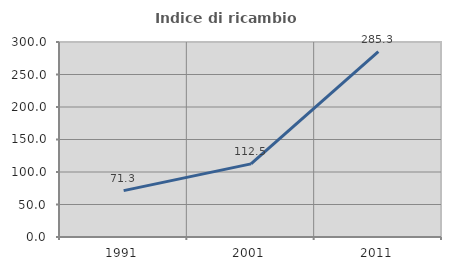
| Category | Indice di ricambio occupazionale  |
|---|---|
| 1991.0 | 71.307 |
| 2001.0 | 112.5 |
| 2011.0 | 285.308 |